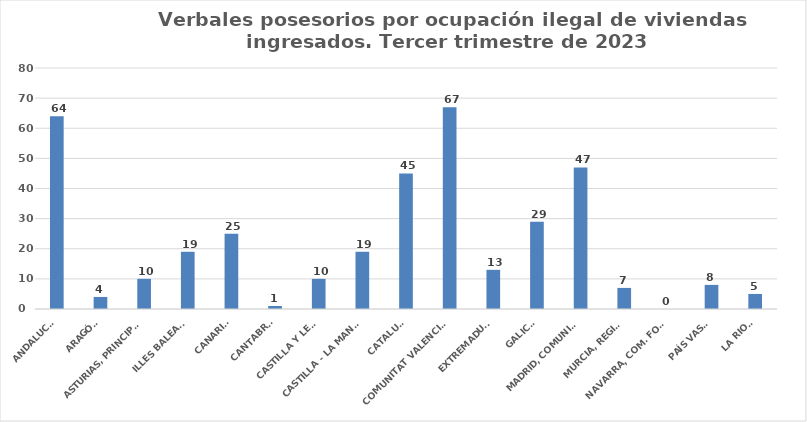
| Category | Series 0 |
|---|---|
| ANDALUCÍA | 64 |
| ARAGÓN | 4 |
| ASTURIAS, PRINCIPADO | 10 |
| ILLES BALEARS | 19 |
| CANARIAS | 25 |
| CANTABRIA | 1 |
| CASTILLA Y LEÓN | 10 |
| CASTILLA - LA MANCHA | 19 |
| CATALUÑA | 45 |
| COMUNITAT VALENCIANA | 67 |
| EXTREMADURA | 13 |
| GALICIA | 29 |
| MADRID, COMUNIDAD | 47 |
| MURCIA, REGIÓN | 7 |
| NAVARRA, COM. FORAL | 0 |
| PAÍS VASCO | 8 |
| LA RIOJA | 5 |